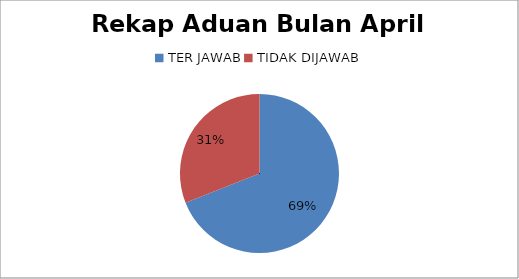
| Category | Series 0 |
|---|---|
| TER JAWAB | 78 |
| TIDAK DIJAWAB | 35 |